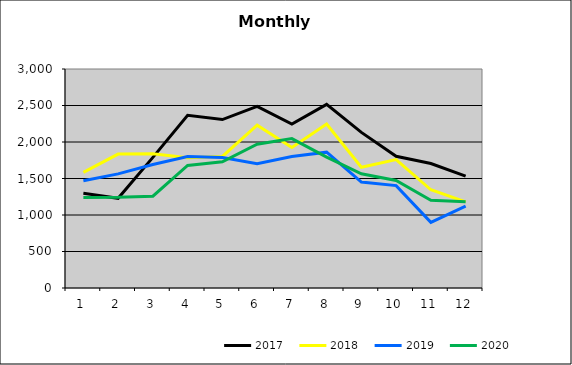
| Category | 2017 | 2018 | 2019 | 2020 |
|---|---|---|---|---|
| 0 | 1297.347 | 1584.945 | 1467.961 | 1241.004 |
| 1 | 1228.546 | 1834.566 | 1563.301 | 1241.851 |
| 2 | 1789.782 | 1838.878 | 1692.17 | 1257.948 |
| 3 | 2364.914 | 1785.082 | 1799.954 | 1678.799 |
| 4 | 2307.576 | 1801.761 | 1787.008 | 1728.302 |
| 5 | 2488.575 | 2229.629 | 1700.928 | 1969.438 |
| 6 | 2244.746 | 1923.685 | 1800.379 | 2046.582 |
| 7 | 2515.952 | 2246.519 | 1860.378 | 1792.692 |
| 8 | 2131.972 | 1654.017 | 1451.067 | 1563.851 |
| 9 | 1804.009 | 1760.102 | 1402.587 | 1472.076 |
| 10 | 1705.861 | 1345.712 | 899.124 | 1200.772 |
| 11 | 1533.212 | 1179.594 | 1120.919 | 1181.152 |